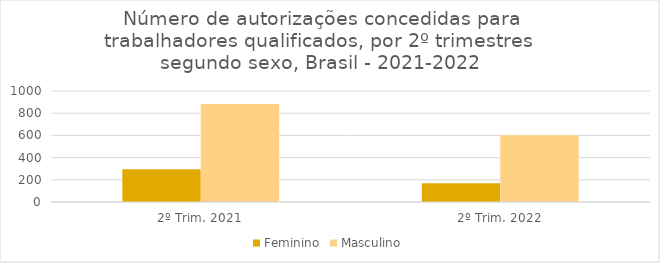
| Category | Feminino | Masculino |
|---|---|---|
| 2º Trim. 2021 | 294 | 884 |
| 2º Trim. 2022 | 168 | 602 |